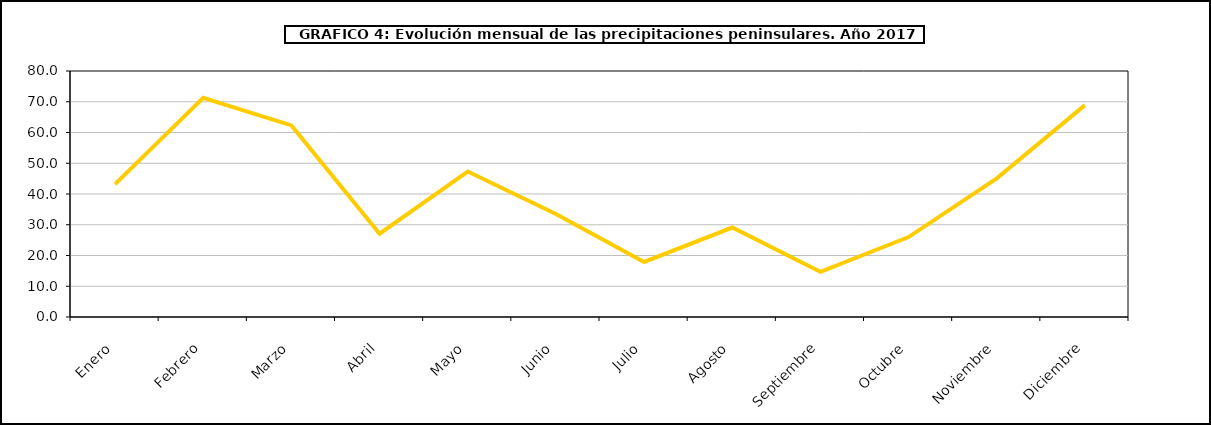
| Category | peninsula |
|---|---|
| 0 | 43.2 |
| 1 | 71.3 |
| 2 | 62.3 |
| 3 | 27.1 |
| 4 | 47.3 |
| 5 | 33.5 |
| 6 | 17.9 |
| 7 | 29.1 |
| 8 | 14.7 |
| 9 | 26 |
| 10 | 45.1 |
| 11 | 68.9 |